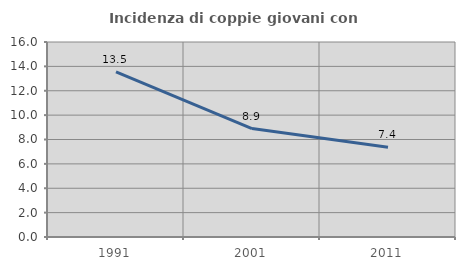
| Category | Incidenza di coppie giovani con figli |
|---|---|
| 1991.0 | 13.55 |
| 2001.0 | 8.894 |
| 2011.0 | 7.364 |